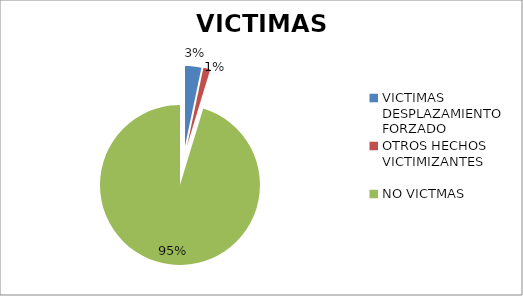
| Category | Series 0 | Series 1 |
|---|---|---|
| VICTIMAS DESPLAZAMIENTO FORZADO | 3200 |  |
| OTROS HECHOS  VICTIMIZANTES  | 1367 |  |
| NO VICTMAS  | 92720 |  |